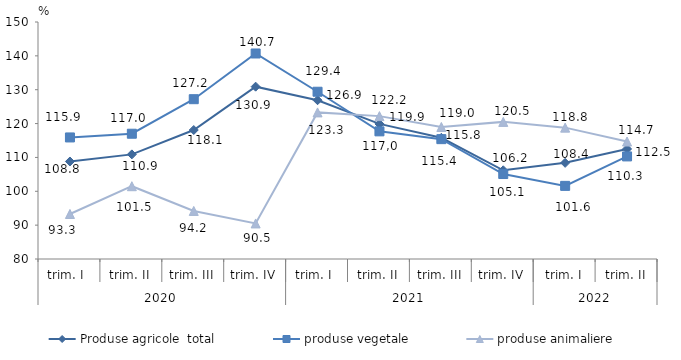
| Category | Produse agricole  total | produse vegetale | produse animaliere |
|---|---|---|---|
| 0 | 108.8 | 115.9 | 93.3 |
| 1 | 110.9 | 117 | 101.5 |
| 2 | 118.1 | 127.2 | 94.2 |
| 3 | 130.9 | 140.7 | 90.5 |
| 4 | 126.9 | 129.4 | 123.3 |
| 5 | 119.9 | 117.7 | 122.2 |
| 6 | 115.8 | 115.4 | 119 |
| 7 | 106.2 | 105.1 | 120.5 |
| 8 | 108.4 | 101.6 | 118.8 |
| 9 | 112.5 | 110.3 | 114.7 |